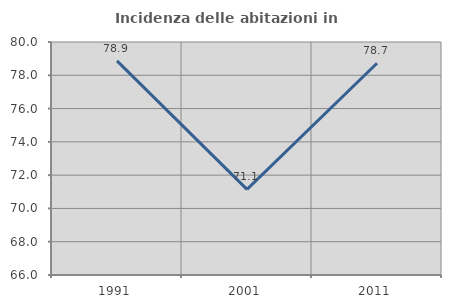
| Category | Incidenza delle abitazioni in proprietà  |
|---|---|
| 1991.0 | 78.866 |
| 2001.0 | 71.144 |
| 2011.0 | 78.723 |